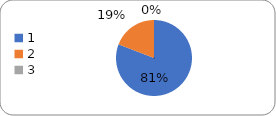
| Category | Series 0 |
|---|---|
| 0 | 76 |
| 1 | 18 |
| 2 | 0 |